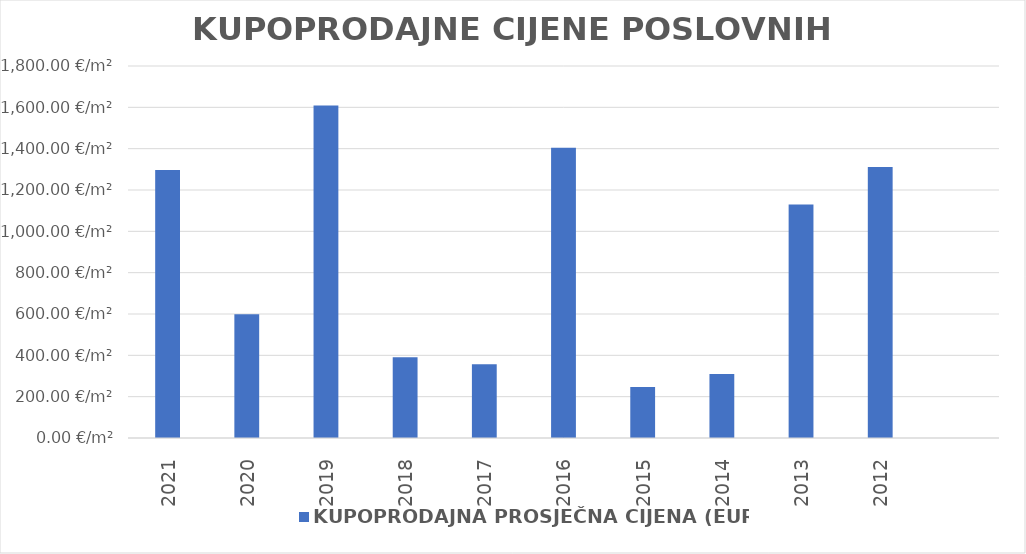
| Category | KUPOPRODAJNA PROSJEČNA CIJENA (EUR/m²) |
|---|---|
| 2021 | 1903-07-20 05:11:08 |
| 2020 | 1901-08-20 21:32:56 |
| 2019 | 1904-05-26 14:58:11 |
| 2018 | 1901-01-24 08:38:43 |
| 2017 | 1900-12-21 20:13:16 |
| 2016 | 1903-11-04 17:27:54 |
| 2015 | 1900-09-02 14:29:30 |
| 2014 | 1900-11-04 16:37:40 |
| 2013 | 1903-02-02 10:50:56 |
| 2012 | 1903-08-03 19:49:10 |